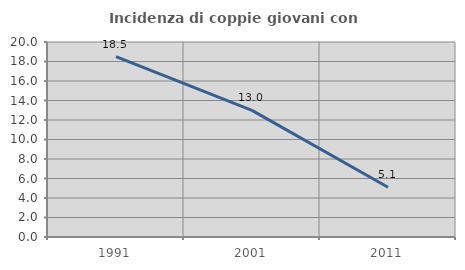
| Category | Incidenza di coppie giovani con figli |
|---|---|
| 1991.0 | 18.493 |
| 2001.0 | 12.987 |
| 2011.0 | 5.109 |